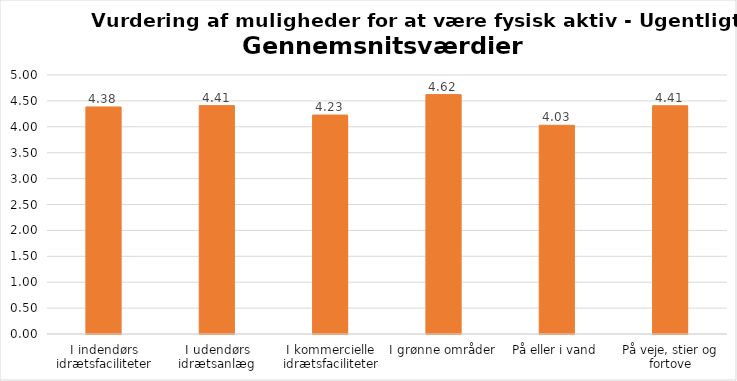
| Category | Gennemsnit |
|---|---|
| I indendørs idrætsfaciliteter | 4.383 |
| I udendørs idrætsanlæg | 4.409 |
| I kommercielle idrætsfaciliteter | 4.226 |
| I grønne områder | 4.621 |
| På eller i vand | 4.03 |
| På veje, stier og fortove | 4.406 |